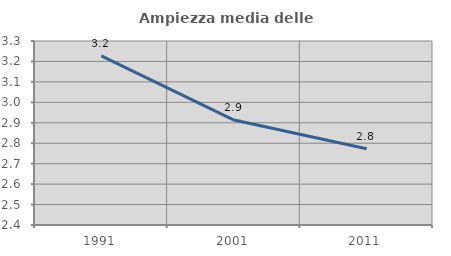
| Category | Ampiezza media delle famiglie |
|---|---|
| 1991.0 | 3.227 |
| 2001.0 | 2.913 |
| 2011.0 | 2.773 |